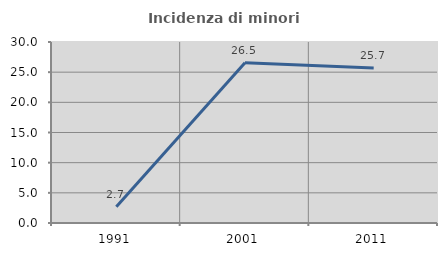
| Category | Incidenza di minori stranieri |
|---|---|
| 1991.0 | 2.703 |
| 2001.0 | 26.549 |
| 2011.0 | 25.69 |